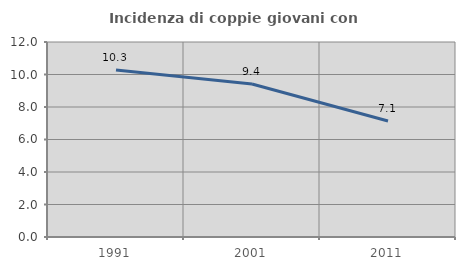
| Category | Incidenza di coppie giovani con figli |
|---|---|
| 1991.0 | 10.283 |
| 2001.0 | 9.412 |
| 2011.0 | 7.143 |